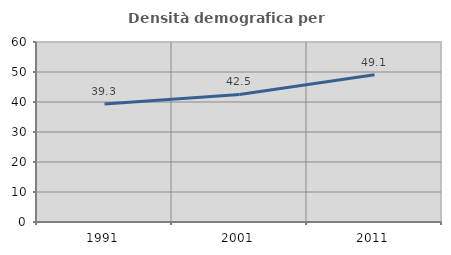
| Category | Densità demografica |
|---|---|
| 1991.0 | 39.341 |
| 2001.0 | 42.518 |
| 2011.0 | 49.058 |